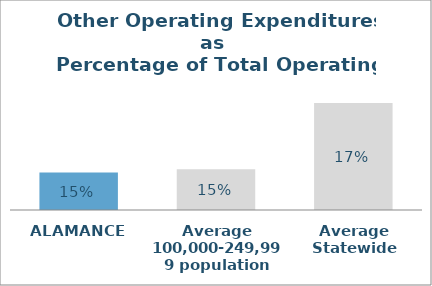
| Category | Series 0 |
|---|---|
| ALAMANCE | 0.152 |
| Average 100,000-249,999 population | 0.153 |
| Average Statewide | 0.166 |